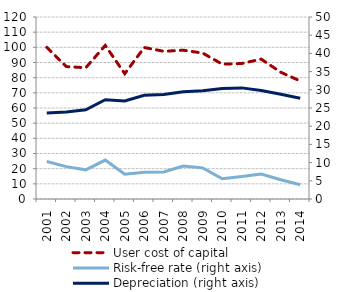
| Category | User cost of capital |
|---|---|
| 2001.0 | 100 |
| 2002.0 | 87.321 |
| 2003.0 | 86.543 |
| 2004.0 | 101.254 |
| 2005.0 | 82.628 |
| 2006.0 | 99.891 |
| 2007.0 | 97.4 |
| 2008.0 | 98.098 |
| 2009.0 | 96.21 |
| 2010.0 | 88.882 |
| 2011.0 | 89.348 |
| 2012.0 | 92.21 |
| 2013.0 | 83.57 |
| 2014.0 | 77.807 |